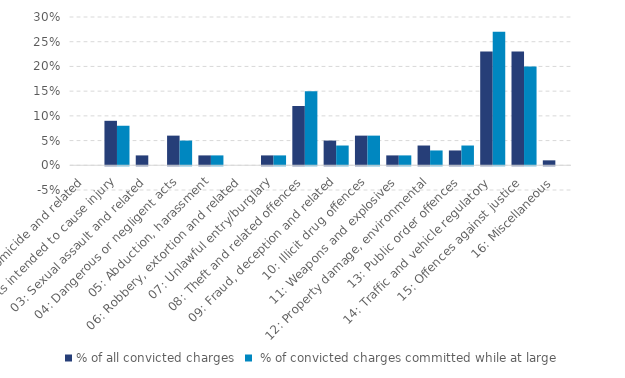
| Category | % of all convicted charges |  % of convicted charges committed while at large |
|---|---|---|
| 01: Homicide and related | 0 | 0 |
| 02: Acts intended to cause injury | 0.09 | 0.08 |
| 03: Sexual assault and related | 0.02 | 0 |
| 04: Dangerous or negligent acts | 0.06 | 0.05 |
| 05: Abduction, harassment | 0.02 | 0.02 |
| 06: Robbery, extortion and related | 0 | 0 |
| 07: Unlawful entry/burglary | 0.02 | 0.02 |
| 08: Theft and related offences | 0.12 | 0.15 |
| 09: Fraud, deception and related | 0.05 | 0.04 |
| 10: Illicit drug offences | 0.06 | 0.06 |
| 11: Weapons and explosives | 0.02 | 0.02 |
| 12: Property damage, environmental | 0.04 | 0.03 |
| 13: Public order offences | 0.03 | 0.04 |
| 14: Traffic and vehicle regulatory | 0.23 | 0.27 |
| 15: Offences against justice | 0.23 | 0.2 |
| 16: Miscellaneous | 0.01 | 0 |